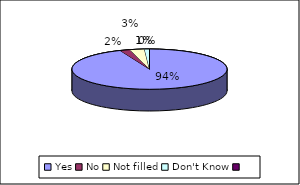
| Category | After the procedure were you given instructions about what to do. E.g. when to have stitches out |
|---|---|
| Yes | 91 |
| No | 2 |
| Not filled | 3 |
| Don't Know | 1 |